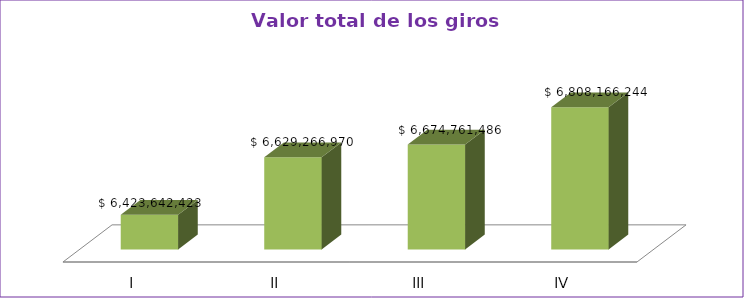
| Category | Series 0 |
|---|---|
| I | 6423642423 |
| II | 6629266970 |
| III | 6674761486 |
| IV | 6808166244 |